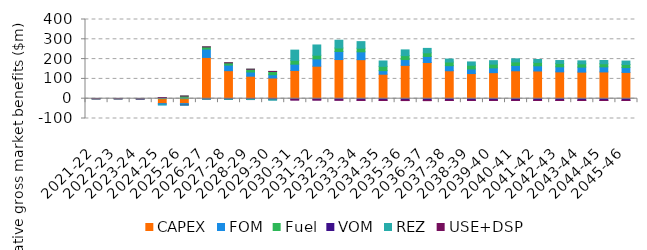
| Category | CAPEX | FOM | Fuel | VOM | REZ | USE+DSP |
|---|---|---|---|---|---|---|
| 2021-22 | -0.003 | 0 | -0.011 | 0 | 0 | 0 |
| 2022-23 | -0.009 | -0.002 | -0.022 | 0.001 | 0 | 0 |
| 2023-24 | -0.451 | -0.112 | 0.037 | -0.001 | -0.001 | -0.001 |
| 2024-25 | -24.831 | -6.197 | 4.994 | 0.406 | -0.001 | 0.076 |
| 2025-26 | -24.834 | -6.197 | 13.371 | -0.588 | -0.001 | 0.076 |
| 2026-27 | 208.39 | 42.221 | 11.005 | -2.012 | -0.001 | 0.076 |
| 2027-28 | 141.593 | 28.157 | 11.457 | -3.097 | -0.001 | 0.075 |
| 2028-29 | 113.636 | 21.201 | 14.109 | -4.203 | -0.001 | 0.075 |
| 2029-30 | 104.583 | 16.434 | 16.618 | -4.908 | -2.54 | 0.075 |
| 2030-31 | 142.57 | 31.893 | 19.085 | -5.532 | 51.785 | -1.251 |
| 2031-32 | 164.174 | 36.855 | 18.556 | -5.805 | 51.784 | -1.251 |
| 2032-33 | 197.765 | 40.836 | 17.526 | -6.557 | 39.024 | -1.242 |
| 2033-34 | 197.146 | 39.654 | 18.216 | -7.476 | 33.193 | -1.298 |
| 2034-35 | 123.653 | 18.061 | 21.824 | -7.903 | 26.94 | -1.298 |
| 2035-36 | 168.369 | 29.344 | 19.935 | -8.342 | 28.85 | -1.091 |
| 2036-37 | 182.695 | 30.754 | 18.239 | -8.756 | 22.353 | -1.107 |
| 2037-38 | 141.105 | 25.65 | 18.451 | -8.774 | 14.956 | -0.076 |
| 2038-39 | 126.967 | 22.95 | 18.999 | -8.631 | 16.73 | -0.076 |
| 2039-40 | 131.506 | 24.201 | 18.863 | -8.565 | 17.427 | -0.074 |
| 2040-41 | 141.07 | 26.814 | 17.931 | -8.685 | 15.426 | -0.074 |
| 2041-42 | 140.059 | 26.049 | 17.375 | -8.835 | 14.401 | -0.164 |
| 2042-43 | 135.544 | 25.476 | 17.29 | -8.88 | 14.466 | -0.133 |
| 2043-44 | 134.278 | 25.115 | 16.665 | -9.004 | 15.112 | -0.142 |
| 2044-45 | 135.224 | 25.579 | 15.613 | -9.121 | 16.582 | -0.017 |
| 2045-46 | 132.733 | 24.431 | 15.85 | -8.675 | 17.062 | -0.46 |